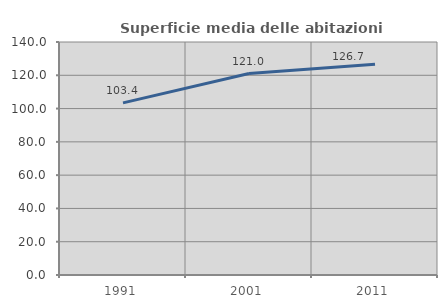
| Category | Superficie media delle abitazioni occupate |
|---|---|
| 1991.0 | 103.426 |
| 2001.0 | 121.035 |
| 2011.0 | 126.667 |